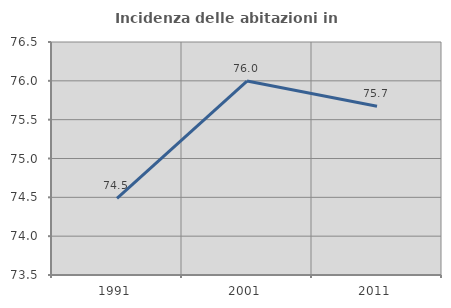
| Category | Incidenza delle abitazioni in proprietà  |
|---|---|
| 1991.0 | 74.488 |
| 2001.0 | 75.997 |
| 2011.0 | 75.672 |